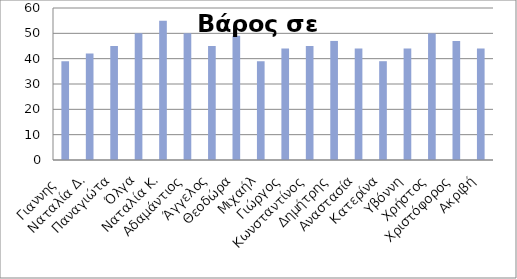
| Category | Βάρος σε kg |
|---|---|
| Γιαννης  | 39 |
| Ναταλία Δ. | 42 |
| Παναγιώτα  | 45 |
| Όλγα | 50 |
| Ναταλία Κ. | 55 |
| Αδαμάντιος | 50 |
| Άγγελος | 45 |
| Θεοδώρα | 49 |
| Μιχαήλ | 39 |
| Γιώργος | 44 |
| Κωνσταντίνος | 45 |
| Δημήτρης | 47 |
| Αναστασία | 44 |
| Κατερίνα | 39 |
| Υβόννη | 44 |
| Χρήστος | 50 |
| Χριστόφορος | 47 |
| Ακριβή | 44 |